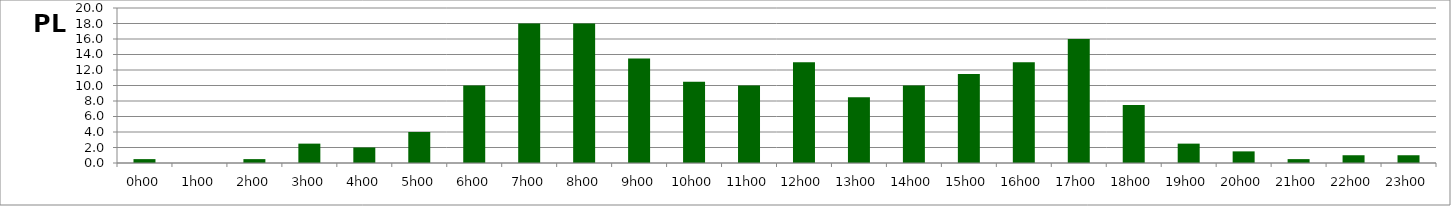
| Category | PL |
|---|---|
| 0.0 | 0.5 |
| 0.041666666666666664 | 0 |
| 0.08333333333333333 | 0.5 |
| 0.125 | 2.5 |
| 0.16666666666666666 | 2 |
| 0.20833333333333334 | 4 |
| 0.25 | 10 |
| 0.2916666666666667 | 18 |
| 0.3333333333333333 | 18 |
| 0.375 | 13.5 |
| 0.4166666666666667 | 10.5 |
| 0.4583333333333333 | 10 |
| 0.5 | 13 |
| 0.5416666666666666 | 8.5 |
| 0.5833333333333334 | 10 |
| 0.625 | 11.5 |
| 0.6666666666666666 | 13 |
| 0.7083333333333334 | 16 |
| 0.75 | 7.5 |
| 0.7916666666666666 | 2.5 |
| 0.8333333333333334 | 1.5 |
| 0.875 | 0.5 |
| 0.9166666666666666 | 1 |
| 0.9583333333333334 | 1 |